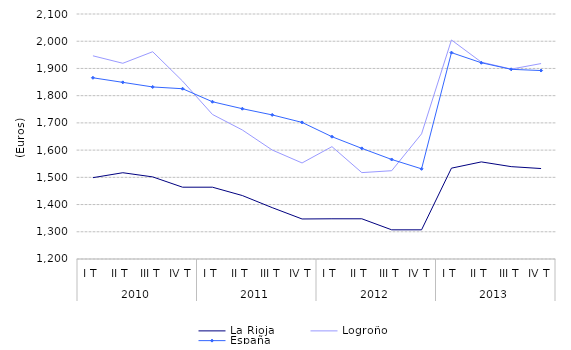
| Category | La Rioja | Logroño | España |
|---|---|---|---|
| 0 | 1498.8 | 1946.4 | 1865.7 |
| 1 | 1516.9 | 1919 | 1848.9 |
| 2 | 1501.6 | 1961.4 | 1832 |
| 3 | 1463.8 | 1853.5 | 1825.5 |
| 4 | 1463.8 | 1731 | 1777.6 |
| 5 | 1433.1 | 1674 | 1752.1 |
| 6 | 1388.7 | 1600.4 | 1729.3 |
| 7 | 1347 | 1552.8 | 1701.8 |
| 8 | 1347.7 | 1612.8 | 1649.3 |
| 9 | 1347.7 | 1517.3 | 1606.4 |
| 10 | 1307.2 | 1524.3 | 1565.6 |
| 11 | 1307.2 | 1659.8 | 1531.2 |
| 12 | 1533.7 | 2004.6 | 1958.1 |
| 13 | 1556.7 | 1923.2 | 1920.9 |
| 14 | 1539.3 | 1897.6 | 1896.8 |
| 15 | 1532.3 | 1917.9 | 1892.3 |